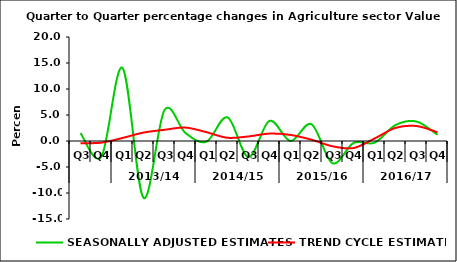
| Category | SEASONALLY ADJUSTED ESTIMATES | TREND CYCLE ESTIMATES |
|---|---|---|
| 0 | 1.521 | -0.428 |
| 1 | -2.963 | -0.314 |
| 2 | 14.048 | 0.578 |
| 3 | -10.932 | 1.622 |
| 4 | 5.947 | 2.153 |
| 5 | 1.539 | 2.579 |
| 6 | -0.131 | 1.695 |
| 7 | 4.55 | 0.619 |
| 8 | -3.077 | 0.877 |
| 9 | 3.866 | 1.422 |
| 10 | 0.004 | 1.173 |
| 11 | 3.222 | 0.252 |
| 12 | -4.279 | -1.009 |
| 13 | -0.382 | -1.351 |
| 14 | -0.329 | 0.47 |
| 15 | 3.058 | 2.522 |
| 16 | 3.744 | 2.882 |
| 17 | 1.202 | 1.68 |